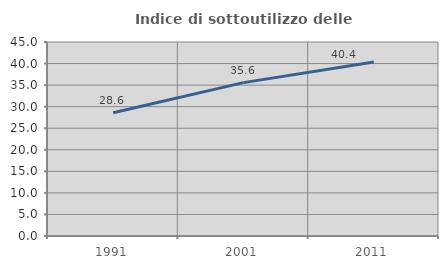
| Category | Indice di sottoutilizzo delle abitazioni  |
|---|---|
| 1991.0 | 28.609 |
| 2001.0 | 35.578 |
| 2011.0 | 40.362 |